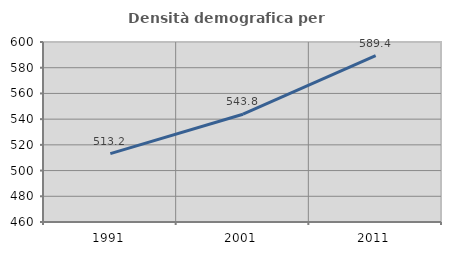
| Category | Densità demografica |
|---|---|
| 1991.0 | 513.198 |
| 2001.0 | 543.808 |
| 2011.0 | 589.427 |